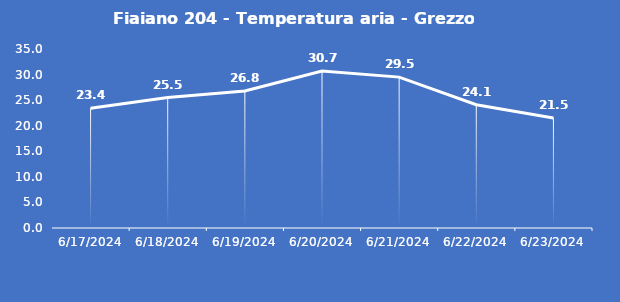
| Category | Fiaiano 204 - Temperatura aria - Grezzo (°C) |
|---|---|
| 6/17/24 | 23.4 |
| 6/18/24 | 25.5 |
| 6/19/24 | 26.8 |
| 6/20/24 | 30.7 |
| 6/21/24 | 29.5 |
| 6/22/24 | 24.1 |
| 6/23/24 | 21.5 |